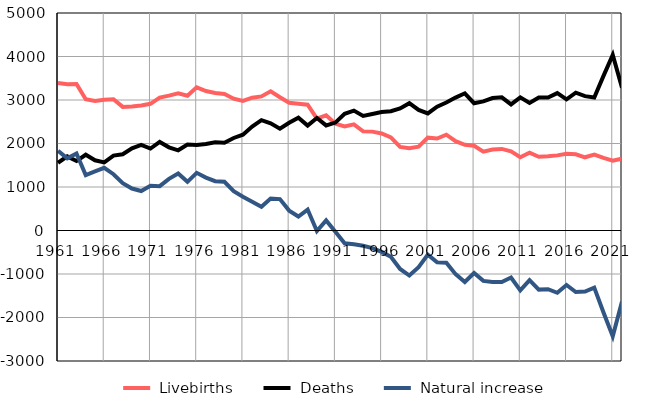
| Category |  Livebirths |  Deaths |  Natural increase |
|---|---|---|---|
| 1961.0 | 3389 | 1555 | 1834 |
| 1962.0 | 3361 | 1703 | 1658 |
| 1963.0 | 3368 | 1597 | 1771 |
| 1964.0 | 3016 | 1742 | 1274 |
| 1965.0 | 2976 | 1615 | 1361 |
| 1966.0 | 3008 | 1567 | 1441 |
| 1967.0 | 3016 | 1722 | 1294 |
| 1968.0 | 2841 | 1752 | 1089 |
| 1969.0 | 2853 | 1888 | 965 |
| 1970.0 | 2875 | 1967 | 908 |
| 1971.0 | 2912 | 1883 | 1029 |
| 1972.0 | 3055 | 2035 | 1020 |
| 1973.0 | 3100 | 1912 | 1188 |
| 1974.0 | 3156 | 1844 | 1312 |
| 1975.0 | 3097 | 1978 | 1119 |
| 1976.0 | 3290 | 1964 | 1326 |
| 1977.0 | 3205 | 1989 | 1216 |
| 1978.0 | 3162 | 2028 | 1134 |
| 1979.0 | 3137 | 2016 | 1121 |
| 1980.0 | 3030 | 2127 | 903 |
| 1981.0 | 2977 | 2201 | 776 |
| 1982.0 | 3052 | 2390 | 662 |
| 1983.0 | 3082 | 2536 | 546 |
| 1984.0 | 3199 | 2464 | 735 |
| 1985.0 | 3062 | 2340 | 722 |
| 1986.0 | 2935 | 2478 | 457 |
| 1987.0 | 2916 | 2594 | 322 |
| 1988.0 | 2893 | 2412 | 481 |
| 1989.0 | 2574 | 2587 | -13 |
| 1990.0 | 2647 | 2416 | 231 |
| 1991.0 | 2454 | 2481 | -27 |
| 1992.0 | 2391 | 2684 | -293 |
| 1993.0 | 2441 | 2756 | -315 |
| 1994.0 | 2281 | 2633 | -352 |
| 1995.0 | 2273 | 2677 | -404 |
| 1996.0 | 2231 | 2722 | -491 |
| 1997.0 | 2140 | 2743 | -603 |
| 1998.0 | 1921 | 2806 | -885 |
| 1999.0 | 1891 | 2927 | -1036 |
| 2000.0 | 1927 | 2772 | -845 |
| 2001.0 | 2134 | 2690 | -556 |
| 2002.0 | 2114 | 2845 | -731 |
| 2003.0 | 2202 | 2941 | -739 |
| 2004.0 | 2053 | 3056 | -1003 |
| 2005.0 | 1971 | 3154 | -1183 |
| 2006.0 | 1949 | 2926 | -977 |
| 2007.0 | 1811 | 2969 | -1158 |
| 2008.0 | 1863 | 3046 | -1183 |
| 2009.0 | 1876 | 3062 | -1186 |
| 2010.0 | 1818 | 2899 | -1081 |
| 2011.0 | 1684 | 3061 | -1377 |
| 2012.0 | 1790 | 2931 | -1141 |
| 2013.0 | 1696 | 3055 | -1359 |
| 2014.0 | 1707 | 3057 | -1350 |
| 2015.0 | 1727 | 3159 | -1432 |
| 2016.0 | 1763 | 3016 | -1253 |
| 2017.0 | 1753 | 3167 | -1414 |
| 2018.0 | 1683 | 3088 | -1405 |
| 2019.0 | 1744 | 3056 | -1312 |
| 2020.0 | 1668 | 3554 | -1886 |
| 2021.0 | 1604 | 4036 | -2432 |
| 2022.0 | 1652 | 3284 | -1632 |